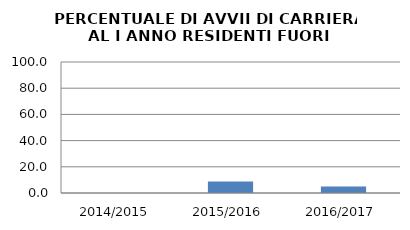
| Category | 2014/2015 2015/2016 2016/2017 |
|---|---|
| 2014/2015 | 0 |
| 2015/2016 | 8.772 |
| 2016/2017 | 4.918 |